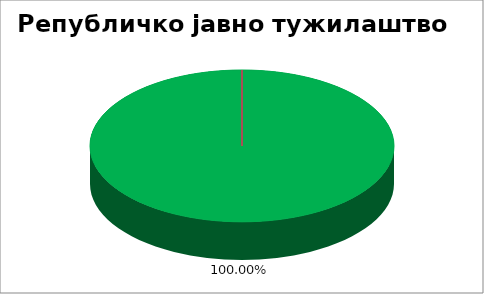
| Category | Републичко јавно тужилаштво  |
|---|---|
| 0 | 1 |
| 1 | 0 |
| 2 | 0 |
| 3 | 0 |
| 4 | 0 |